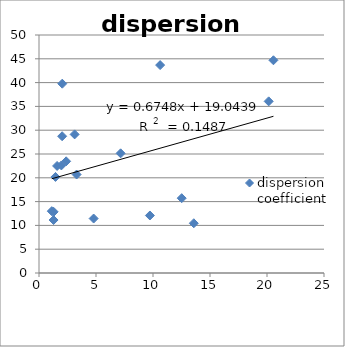
| Category | dispersion coefficient |
|---|---|
| 9.729 | 12.08 |
| 1.962 | 22.6 |
| 2.031 | 28.73 |
| 20.147 | 36.06 |
| 3.125 | 29.12 |
| 1.285 | 12.85 |
| 12.518 | 15.72 |
| 1.122 | 12.99 |
| 2.381 | 23.46 |
| 2.041 | 39.77 |
| 3.299 | 20.69 |
| 1.588 | 22.49 |
| 13.578 | 10.45 |
| 4.794 | 11.44 |
| 7.161 | 25.14 |
| 1.446 | 20.18 |
| 20.565 | 44.69 |
| 1.277 | 11.13 |
| 10.625 | 43.68 |